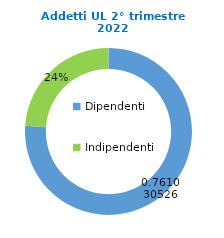
| Category | Series 0 |
|---|---|
| Dipendenti | 70304 |
| Indipendenti | 22076 |